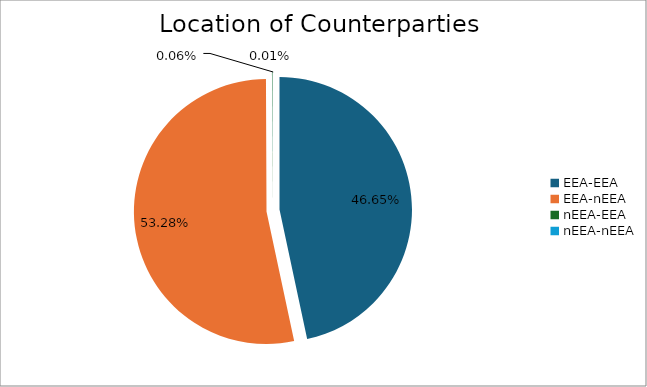
| Category | Series 0 |
|---|---|
| EEA-EEA | 6714967.52 |
| EEA-nEEA | 7669066.26 |
| nEEA-EEA | 8094.035 |
| nEEA-nEEA | 1322.14 |